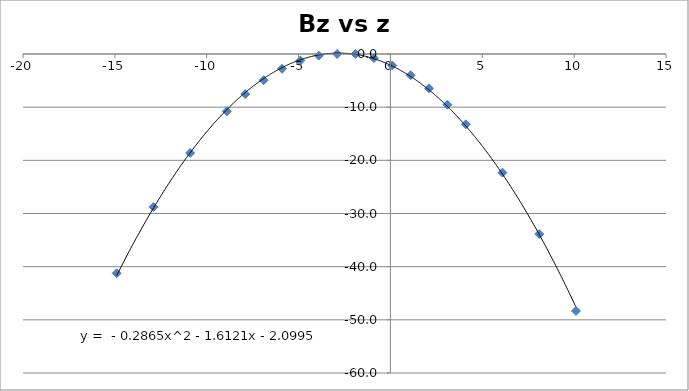
| Category | Bz vs z |
|---|---|
| -14.9 | -41.248 |
| -12.9 | -28.782 |
| -10.9 | -18.623 |
| -8.9 | -10.774 |
| -7.9 | -7.542 |
| -6.9 | -4.925 |
| -5.9 | -2.77 |
| -4.9 | -1.231 |
| -3.9 | -0.308 |
| -2.9 | 0 |
| -1.9 | 0 |
| -0.9 | -0.77 |
| 0.1 | -2.155 |
| 1.1 | -4.002 |
| 2.1 | -6.464 |
| 3.1 | -9.543 |
| 4.1 | -13.236 |
| 6.1 | -22.317 |
| 8.1 | -33.861 |
| 10.1 | -48.328 |